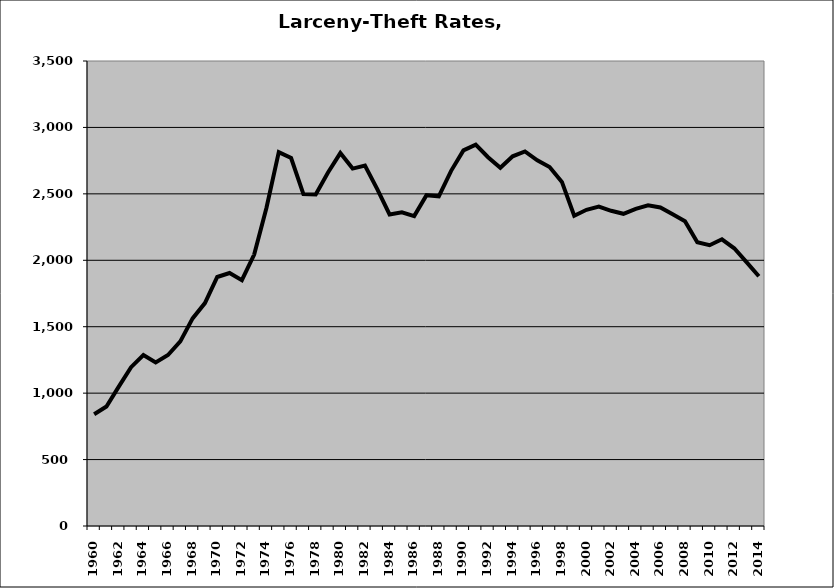
| Category | Larceny-Theft |
|---|---|
| 1960.0 | 840.665 |
| 1961.0 | 899.575 |
| 1962.0 | 1049.268 |
| 1963.0 | 1195.718 |
| 1964.0 | 1287.005 |
| 1965.0 | 1230.563 |
| 1966.0 | 1286.743 |
| 1967.0 | 1389.28 |
| 1968.0 | 1562.542 |
| 1969.0 | 1677.784 |
| 1970.0 | 1874.166 |
| 1971.0 | 1903.944 |
| 1972.0 | 1850.709 |
| 1973.0 | 2043.322 |
| 1974.0 | 2395.985 |
| 1975.0 | 2813.915 |
| 1976.0 | 2769.879 |
| 1977.0 | 2498.668 |
| 1978.0 | 2495.702 |
| 1979.0 | 2660.481 |
| 1980.0 | 2807.07 |
| 1981.0 | 2690.048 |
| 1982.0 | 2713.471 |
| 1983.0 | 2535.663 |
| 1984.0 | 2345.235 |
| 1985.0 | 2361.538 |
| 1986.0 | 2332.922 |
| 1987.0 | 2490.002 |
| 1988.0 | 2481.345 |
| 1989.0 | 2673.234 |
| 1990.0 | 2827.138 |
| 1991.0 | 2870.57 |
| 1992.0 | 2776.069 |
| 1993.0 | 2695.887 |
| 1994.0 | 2782.389 |
| 1995.0 | 2819.542 |
| 1996.0 | 2752.559 |
| 1997.0 | 2701.944 |
| 1998.0 | 2590.1 |
| 1999.0 | 2335.459 |
| 2000.0 | 2379.86 |
| 2001.0 | 2404.067 |
| 2002.0 | 2372.504 |
| 2003.0 | 2349.937 |
| 2004.0 | 2387.684 |
| 2005.0 | 2414.26 |
| 2006.0 | 2397.252 |
| 2007.0 | 2345.945 |
| 2008.0 | 2293.956 |
| 2009.0 | 2135.88 |
| 2010.0 | 2113.374 |
| 2011.0 | 2158.109 |
| 2012.0 | 2090.434 |
| 2013.0 | 1986.603 |
| 2014.0 | 1880.017 |